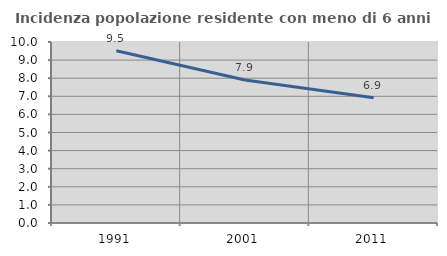
| Category | Incidenza popolazione residente con meno di 6 anni |
|---|---|
| 1991.0 | 9.52 |
| 2001.0 | 7.901 |
| 2011.0 | 6.923 |